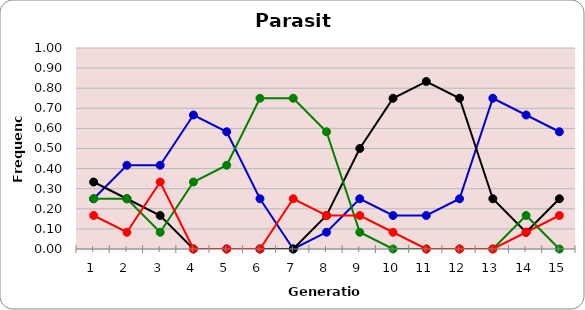
| Category | Sp | Cl | Di | He |
|---|---|---|---|---|
| 1.0 | 0.25 | 0.333 | 0.25 | 0.167 |
| 2.0 | 0.417 | 0.25 | 0.25 | 0.083 |
| 3.0 | 0.417 | 0.167 | 0.083 | 0.333 |
| 4.0 | 0.667 | 0 | 0.333 | 0 |
| 5.0 | 0.583 | 0 | 0.417 | 0 |
| 6.0 | 0.25 | 0 | 0.75 | 0 |
| 7.0 | 0 | 0 | 0.75 | 0.25 |
| 8.0 | 0.083 | 0.167 | 0.583 | 0.167 |
| 9.0 | 0.25 | 0.5 | 0.083 | 0.167 |
| 10.0 | 0.167 | 0.75 | 0 | 0.083 |
| 11.0 | 0.167 | 0.833 | 0 | 0 |
| 12.0 | 0.25 | 0.75 | 0 | 0 |
| 13.0 | 0.75 | 0.25 | 0 | 0 |
| 14.0 | 0.667 | 0.083 | 0.167 | 0.083 |
| 15.0 | 0.583 | 0.25 | 0 | 0.167 |